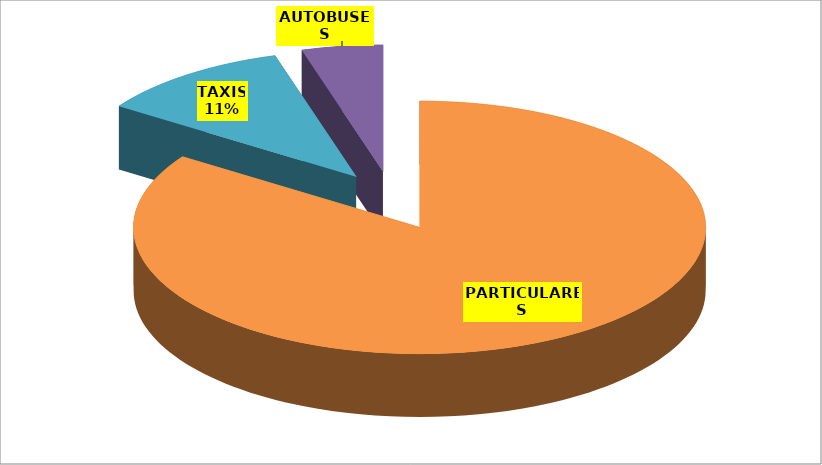
| Category | Series 0 |
|---|---|
| PARTICULARES | 369 |
| TAXIS | 48 |
| AUTOBUSES | 20 |